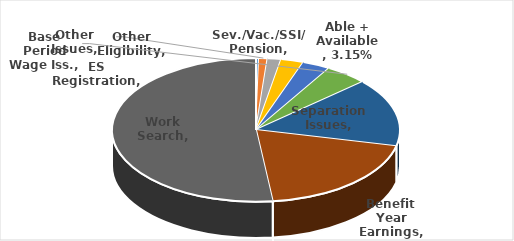
| Category | Series 0 |
|---|---|
| Sev./Vac./SSI/ Pension | 0.003 |
| Other Issues | 0.009 |
| ES Registration | 0.015 |
| Other Eligibility | 0.025 |
| Able + Available | 0.031 |
| Base Period Wage Iss. | 0.048 |
| Separation Issues | 0.153 |
| Benefit Year Earnings | 0.195 |
| Work Search | 0.518 |